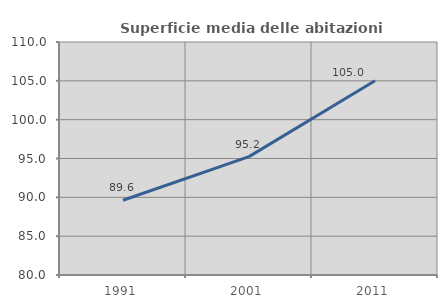
| Category | Superficie media delle abitazioni occupate |
|---|---|
| 1991.0 | 89.62 |
| 2001.0 | 95.245 |
| 2011.0 | 105.006 |